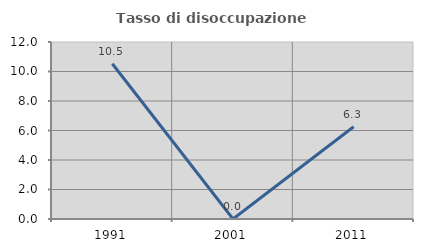
| Category | Tasso di disoccupazione giovanile  |
|---|---|
| 1991.0 | 10.526 |
| 2001.0 | 0 |
| 2011.0 | 6.25 |